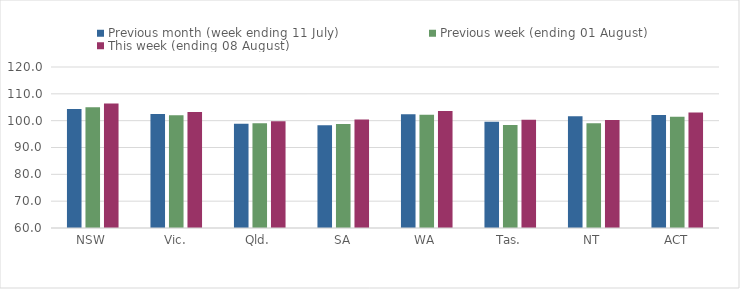
| Category | Previous month (week ending 11 July) | Previous week (ending 01 August) | This week (ending 08 August) |
|---|---|---|---|
| NSW | 104.32 | 105.027 | 106.375 |
| Vic. | 102.451 | 102.011 | 103.274 |
| Qld. | 98.834 | 99.017 | 99.774 |
| SA | 98.25 | 98.713 | 100.425 |
| WA | 102.381 | 102.183 | 103.561 |
| Tas. | 99.598 | 98.392 | 100.36 |
| NT | 101.691 | 99.034 | 100.275 |
| ACT | 102.12 | 101.413 | 103.081 |